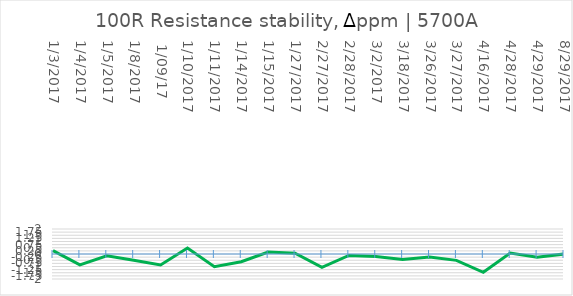
| Category | Series 0 |
|---|---|
| 1/3/2017 | 0.27 |
| 1/4/2017 | -0.87 |
| 1/5/2017 | -0.14 |
| 1/8/2017 | -0.5 |
|  1/09/17 | -0.88 |
| 1/10/2017 | 0.48 |
| 1/11/2017 | -1.02 |
| 1/14/2017 | -0.62 |
| 1/15/2017 | 0.16 |
| 1/27/2017 | 0.06 |
| 2/27/2017 | -1.06 |
| 2/28/2017 | -0.12 |
| 3/2/2017 | -0.2 |
| 3/18/2017 | -0.44 |
| 3/26/2017 | -0.25 |
| 3/27/2017 | -0.51 |
| 4/16/2017 | -1.46 |
| 4/28/2017 | 0.08 |
| 4/29/2017 | -0.25 |
| 8/29/2017 | 0 |